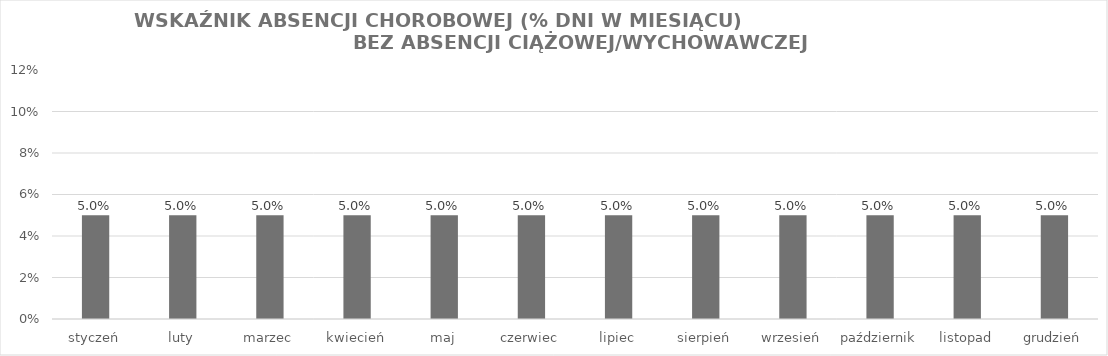
| Category | Series 0 |
|---|---|
| styczeń | 0.05 |
| luty | 0.05 |
| marzec | 0.05 |
| kwiecień | 0.05 |
| maj | 0.05 |
| czerwiec | 0.05 |
| lipiec | 0.05 |
| sierpień | 0.05 |
| wrzesień | 0.05 |
| październik | 0.05 |
| listopad | 0.05 |
| grudzień | 0.05 |